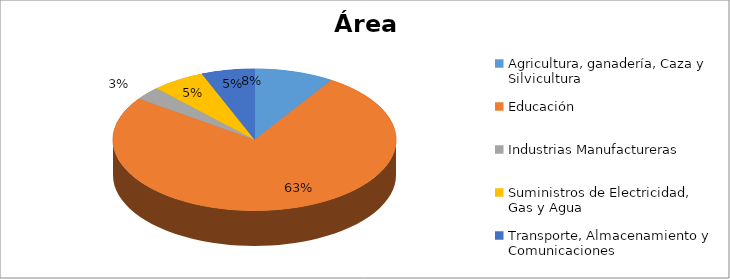
| Category | Series 0 |
|---|---|
| Agricultura, ganadería, Caza y Silvicultura | 0.075 |
| Educación | 0.625 |
| Industrias Manufactureras | 0.025 |
| Suministros de Electricidad, Gas y Agua | 0.05 |
| Transporte, Almacenamiento y Comunicaciones | 0.05 |